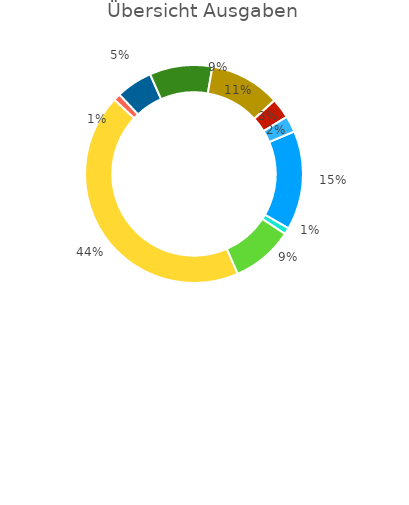
| Category | Ausgaben |
|---|---|
| Auto | 490 |
| Unterhaltung | 32 |
| Essen | 305.75 |
| Wohnung | 1450 |
| Arzt | 35 |
| Persönliche Dinge | 0 |
| Kleider | 180 |
| Kosmetik und Schmuck | 0 |
| Urlaub | 310 |
| Versicherungen | 350 |
| Handy | 100 |
| Nebenkosten | 0 |
| Verschiedenes | 80 |